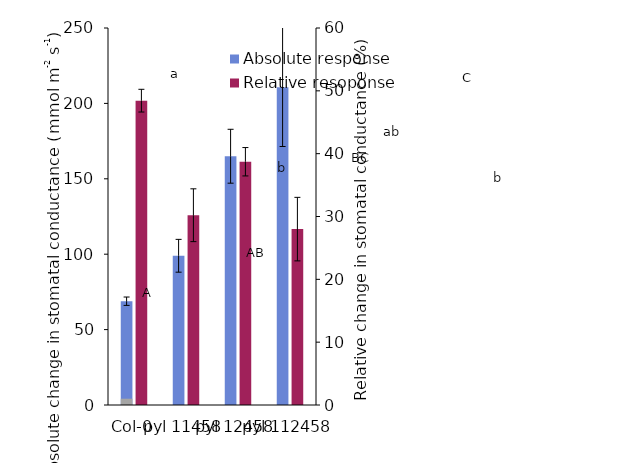
| Category | Absolute response | Series 1 |
|---|---|---|
| Col-0 | 68.827 | 0 |
| pyl 11458 | 98.954 | 0 |
| pyl 12458 | 164.967 | 0 |
| pyl 112458 | 210.712 | 0 |